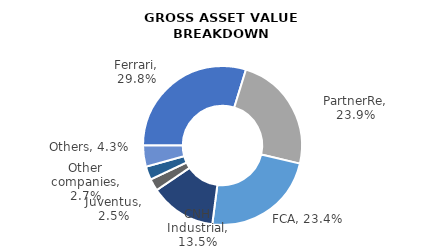
| Category | 31/12/2020 |
|---|---|
| Ferrari | 8383 |
| PartnerRe | 6723 |
| FCA | 6588 |
| CNH Industrial | 3789 |
| Juventus | 691 |
| Other companies | 767 |
| Others | 1210 |